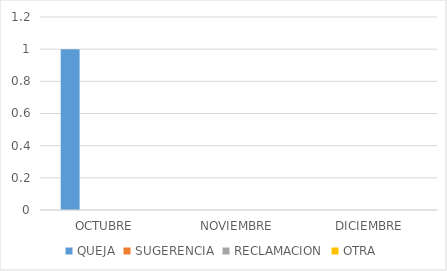
| Category | QUEJA | SUGERENCIA | RECLAMACION | OTRA |
|---|---|---|---|---|
| OCTUBRE | 1 | 0 | 0 | 0 |
| NOVIEMBRE | 0 | 0 | 0 | 0 |
| DICIEMBRE | 0 | 0 | 0 | 0 |